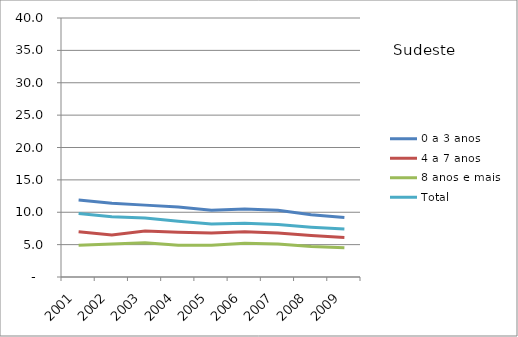
| Category | 0 a 3 anos | 4 a 7 anos | 8 anos e mais | Total |
|---|---|---|---|---|
| 2001.0 | 11.9 | 7 | 4.9 | 9.8 |
| 2002.0 | 11.4 | 6.5 | 5.1 | 9.3 |
| 2003.0 | 11.1 | 7.1 | 5.3 | 9.1 |
| 2004.0 | 10.8 | 6.9 | 4.9 | 8.6 |
| 2005.0 | 10.3 | 6.8 | 4.9 | 8.2 |
| 2006.0 | 10.5 | 7 | 5.2 | 8.3 |
| 2007.0 | 10.3 | 6.8 | 5.1 | 8.1 |
| 2008.0 | 9.6 | 6.4 | 4.7 | 7.7 |
| 2009.0 | 9.2 | 6.1 | 4.5 | 7.4 |